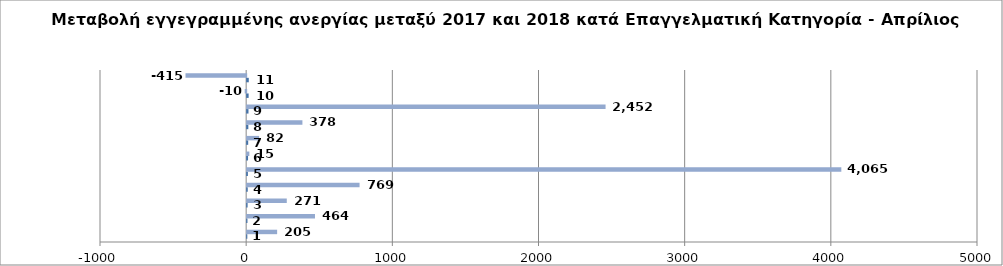
| Category | Series 0 | Series 1 |
|---|---|---|
| 0 | 1 | 205 |
| 1 | 2 | 464 |
| 2 | 3 | 271 |
| 3 | 4 | 769 |
| 4 | 5 | 4065 |
| 5 | 6 | 15 |
| 6 | 7 | 82 |
| 7 | 8 | 378 |
| 8 | 9 | 2452 |
| 9 | 10 | -10 |
| 10 | 11 | -415 |